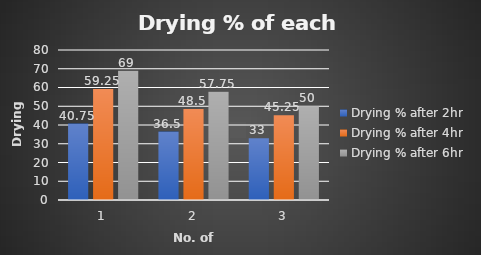
| Category | Drying % after 2hr | Drying % after 4hr | Drying % after 6hr |
|---|---|---|---|
| 0 | 40.75 | 59.25 | 69 |
| 1 | 36.5 | 48.5 | 57.75 |
| 2 | 33 | 45.25 | 50 |